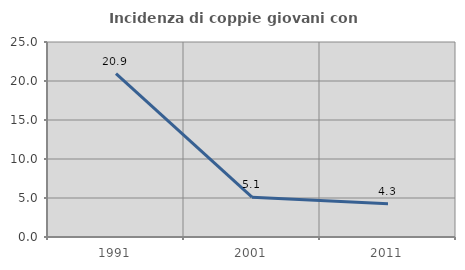
| Category | Incidenza di coppie giovani con figli |
|---|---|
| 1991.0 | 20.94 |
| 2001.0 | 5.106 |
| 2011.0 | 4.274 |